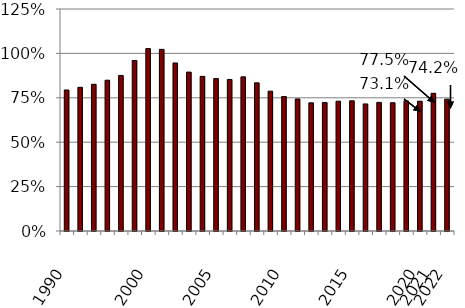
| Category | Ratio |
|---|---|
| 1990.0 | 0.794 |
| nan | 0.809 |
| nan | 0.826 |
| nan | 0.849 |
| nan | 0.876 |
| nan | 0.96 |
| 2000.0 | 1.027 |
| nan | 1.023 |
| nan | 0.946 |
| nan | 0.895 |
| nan | 0.871 |
| 2005.0 | 0.858 |
| nan | 0.853 |
| nan | 0.868 |
| nan | 0.834 |
| nan | 0.787 |
| 2010.0 | 0.757 |
| nan | 0.744 |
| nan | 0.722 |
| nan | 0.723 |
| nan | 0.731 |
| 2015.0 | 0.733 |
| nan | 0.716 |
| nan | 0.724 |
| nan | 0.722 |
| nan | 0.733 |
| 2020.0 | 0.731 |
| 2021.0 | 0.775 |
| 2022.0 | 0.742 |